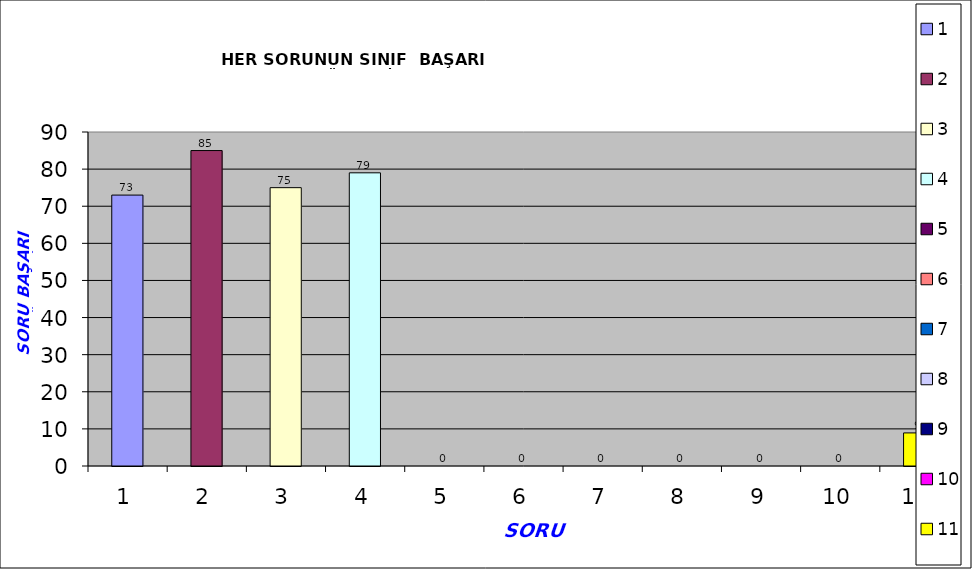
| Category | Series 0 |
|---|---|
| 0 | 73 |
| 1 | 85 |
| 2 | 75 |
| 3 | 79 |
| 4 | 0 |
| 5 | 0 |
| 6 | 0 |
| 7 | 0 |
| 8 | 0 |
| 9 | 0 |
| 10 | 8.914 |